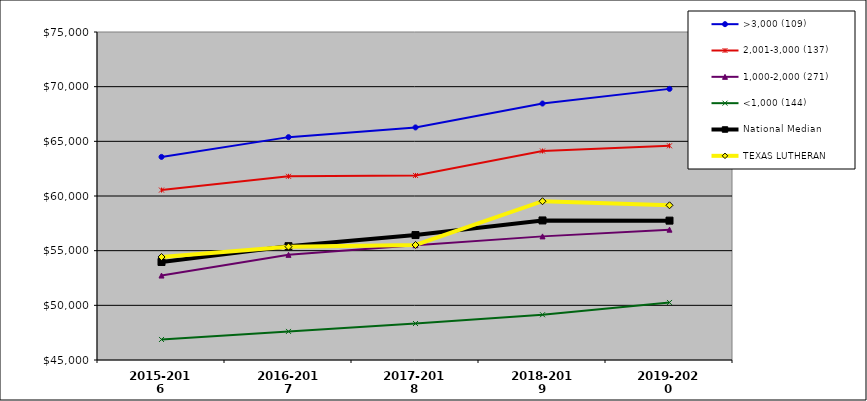
| Category | >3,000 (109) | 2,001-3,000 (137) | 1,000-2,000 (271) | <1,000 (144) | National Median | TEXAS LUTHERAN |
|---|---|---|---|---|---|---|
| 2015-2016 | 63576 | 60543 | 52723 | 46876.5 | 53964 | 54423 |
| 2016-2017 | 65384 | 61802 | 54617 | 47614 | 55410 | 55368 |
| 2017-2018 | 66272 | 61880 | 55503 | 48337 | 56428 | 55522 |
| 2018-2019 | 68458 | 64115 | 56307 | 49140.5 | 57764 | 59522 |
| 2019-2020 | 69798 | 64592 | 56921 | 50263 | 57747 | 59150 |